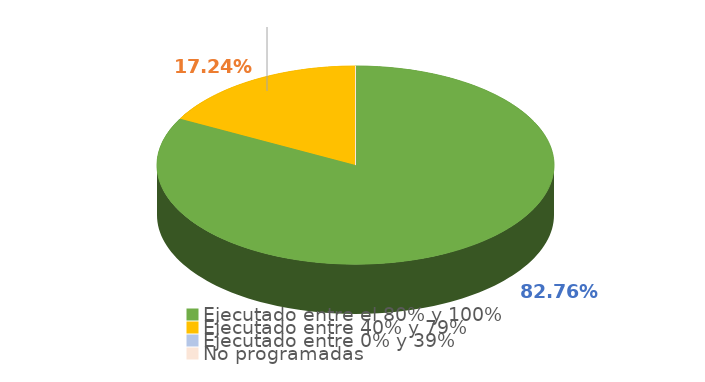
| Category | Series 0 |
|---|---|
| Ejecutado entre el 80% y 100% | 0.828 |
| Ejecutado entre 40% y 79% | 0.172 |
| Ejecutado entre 0% y 39% | 0 |
| No programadas | 0 |